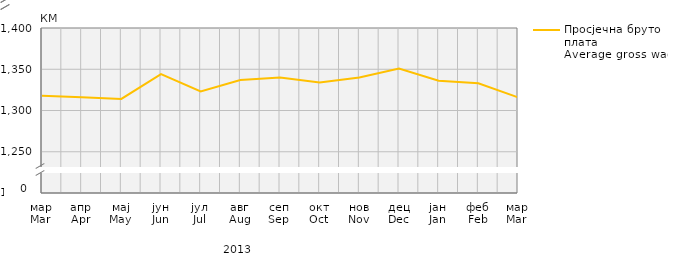
| Category | Просјечна бруто плата
Average gross wage |
|---|---|
| мар
Mar | 1318 |
| апр
Apr | 1316 |
| мај
May | 1314 |
| јун
Jun | 1344 |
| јул
Jul | 1323 |
| авг
Aug | 1337 |
| сеп
Sep | 1340 |
| окт
Oct | 1334 |
| нов
Nov | 1340 |
| дец
Dec | 1351 |
| јан
Jan | 1336 |
| феб
Feb | 1333 |
| мар
Mar | 1316 |